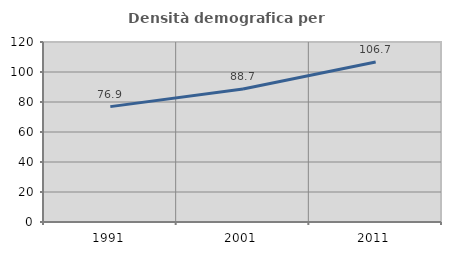
| Category | Densità demografica |
|---|---|
| 1991.0 | 76.92 |
| 2001.0 | 88.693 |
| 2011.0 | 106.655 |